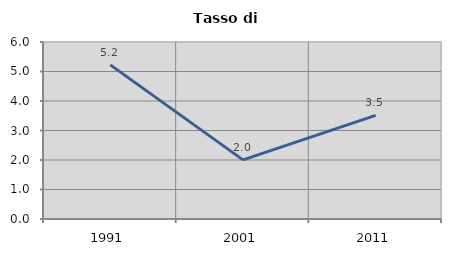
| Category | Tasso di disoccupazione   |
|---|---|
| 1991.0 | 5.224 |
| 2001.0 | 2.005 |
| 2011.0 | 3.515 |